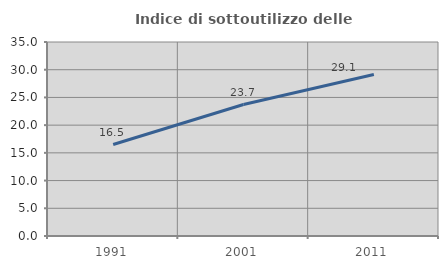
| Category | Indice di sottoutilizzo delle abitazioni  |
|---|---|
| 1991.0 | 16.498 |
| 2001.0 | 23.716 |
| 2011.0 | 29.139 |